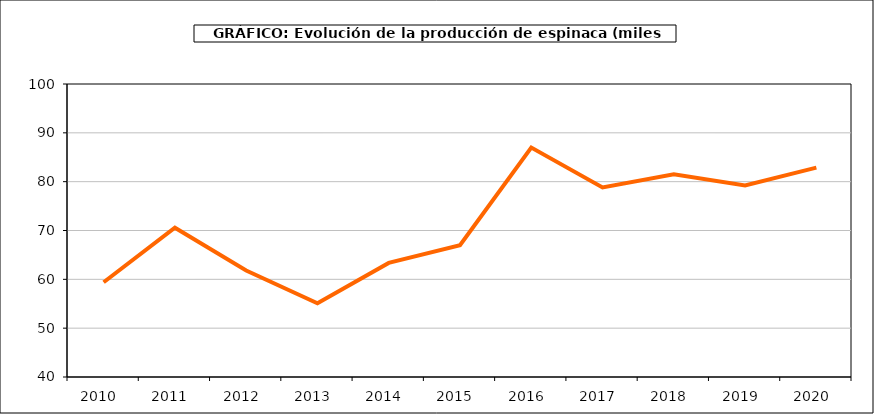
| Category | producción |
|---|---|
| 2010.0 | 59.403 |
| 2011.0 | 70.571 |
| 2012.0 | 61.814 |
| 2013.0 | 55.11 |
| 2014.0 | 63.364 |
| 2015.0 | 66.989 |
| 2016.0 | 86.99 |
| 2017.0 | 78.802 |
| 2018.0 | 81.53 |
| 2019.0 | 79.216 |
| 2020.0 | 82.88 |